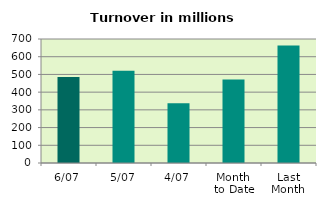
| Category | Series 0 |
|---|---|
| 6/07 | 485.727 |
| 5/07 | 520.46 |
| 4/07 | 336.656 |
| Month 
to Date | 471.263 |
| Last
Month | 663.186 |